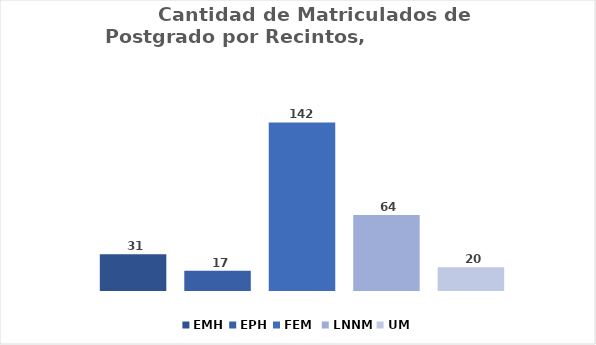
| Category | EMH | EPH | FEM  | LNNM | UM |
|---|---|---|---|---|---|
| Total  | 31 | 17 | 142 | 64 | 20 |